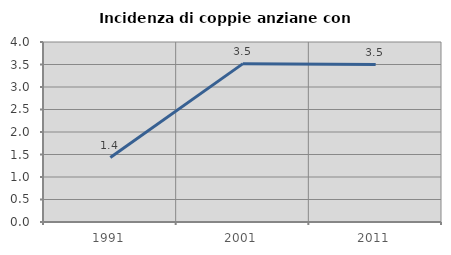
| Category | Incidenza di coppie anziane con figli |
|---|---|
| 1991.0 | 1.433 |
| 2001.0 | 3.519 |
| 2011.0 | 3.499 |